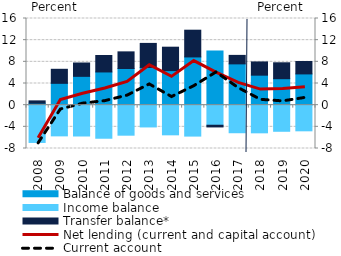
| Category | Balance of goods and services | Income balance | Transfer balance* |
|---|---|---|---|
| 2008.0 | 0.357 | -6.883 | 0.435 |
| 2009.0 | 4.031 | -5.668 | 2.592 |
| 2010.0 | 5.32 | -5.693 | 2.467 |
| 2011.0 | 6.13 | -6.106 | 3.042 |
| 2012.0 | 6.766 | -5.543 | 3.075 |
| 2013.0 | 6.964 | -4.021 | 4.439 |
| 2014.0 | 6.376 | -5.476 | 4.328 |
| 2015.0 | 8.905 | -5.71 | 4.936 |
| 2016.0 | 10.015 | -3.706 | -0.313 |
| 2017.0 | 7.623 | -5.09 | 1.567 |
| 2018.0 | 5.537 | -5.106 | 2.442 |
| 2019.0 | 4.886 | -4.821 | 2.938 |
| 2020.0 | 5.769 | -4.736 | 2.288 |